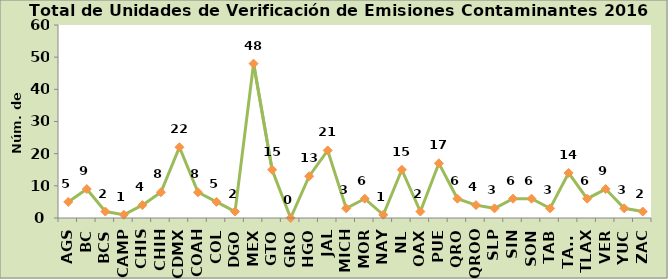
| Category | Series 0 |
|---|---|
| AGS | 5 |
| BC | 9 |
| BCS | 2 |
| CAMP | 1 |
| CHIS | 4 |
| CHIH | 8 |
| CDMX | 22 |
| COAH | 8 |
| COL | 5 |
| DGO | 2 |
| MEX | 48 |
| GTO | 15 |
| GRO | 0 |
| HGO | 13 |
| JAL | 21 |
| MICH | 3 |
| MOR | 6 |
| NAY | 1 |
| NL | 15 |
| OAX | 2 |
| PUE | 17 |
| QRO | 6 |
| QROO | 4 |
| SLP | 3 |
| SIN | 6 |
| SON | 6 |
| TAB | 3 |
| TAMS | 14 |
| TLAX | 6 |
| VER | 9 |
| YUC | 3 |
| ZAC | 2 |